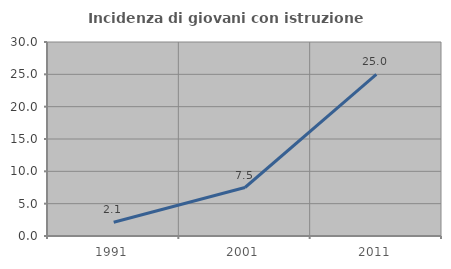
| Category | Incidenza di giovani con istruzione universitaria |
|---|---|
| 1991.0 | 2.128 |
| 2001.0 | 7.5 |
| 2011.0 | 25 |